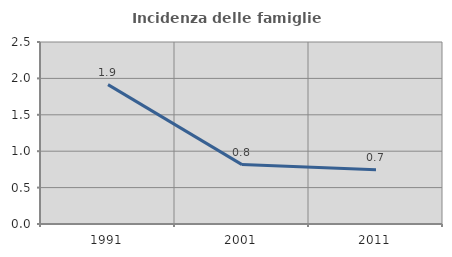
| Category | Incidenza delle famiglie numerose |
|---|---|
| 1991.0 | 1.915 |
| 2001.0 | 0.816 |
| 2011.0 | 0.745 |